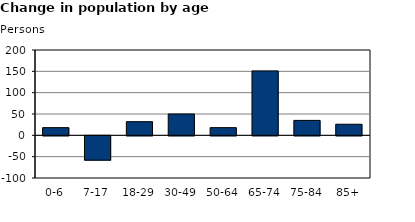
| Category | Series 2 |
|---|---|
| 0-6 | 18 |
| 7-17 | -57 |
| 18-29 | 32 |
| 30-49 | 50 |
| 50-64 | 18 |
| 65-74 | 151 |
| 75-84 | 35 |
| 85+ | 26 |